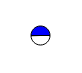
| Category | Series 0 |
|---|---|
| 0 | 3129303 |
| 1 | 3160882 |